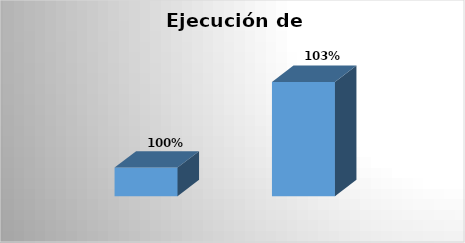
| Category | Series 0 |
|---|---|
| Proyección | 1 |
| Logrado | 1.03 |